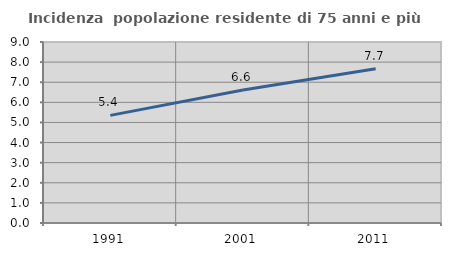
| Category | Incidenza  popolazione residente di 75 anni e più |
|---|---|
| 1991.0 | 5.352 |
| 2001.0 | 6.614 |
| 2011.0 | 7.672 |